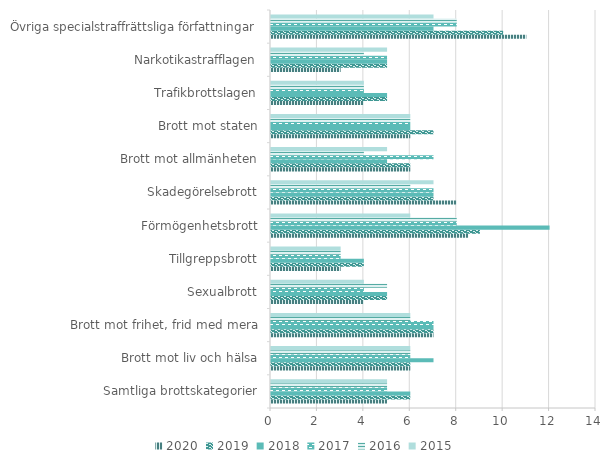
| Category | 2020 | 2019 | 2018 | 2017 | 2016 | 2015 |
|---|---|---|---|---|---|---|
| Samtliga brottskategorier | 5 | 6 | 6 | 5 | 5 | 5 |
| Brott mot liv och hälsa | 6 | 6 | 7 | 6 | 6 | 6 |
| Brott mot frihet, frid med mera | 7 | 7 | 7 | 7 | 6 | 6 |
| Sexualbrott | 4 | 5 | 5 | 4 | 5 | 4 |
| Tillgreppsbrott | 3 | 4 | 4 | 3 | 3 | 3 |
| Förmögenhetsbrott | 8.5 | 9 | 12 | 8 | 8 | 6 |
| Skadegörelsebrott | 8 | 7 | 7 | 7 | 6 | 7 |
| Brott mot allmänheten | 6 | 6 | 5 | 7 | 4 | 5 |
| Brott mot staten | 6 | 7 | 6 | 6 | 6 | 6 |
| Trafikbrottslagen | 4 | 5 | 5 | 4 | 4 | 4 |
| Narkotikastrafflagen | 3 | 5 | 5 | 5 | 4 | 5 |
| Övriga specialstraffrättsliga författningar | 11 | 10 | 7 | 8 | 8 | 7 |